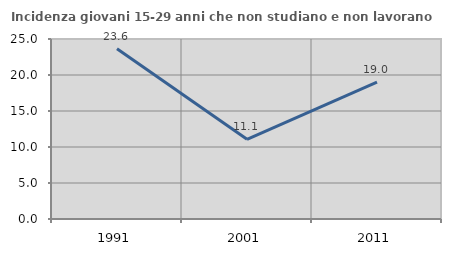
| Category | Incidenza giovani 15-29 anni che non studiano e non lavorano  |
|---|---|
| 1991.0 | 23.638 |
| 2001.0 | 11.068 |
| 2011.0 | 19.012 |